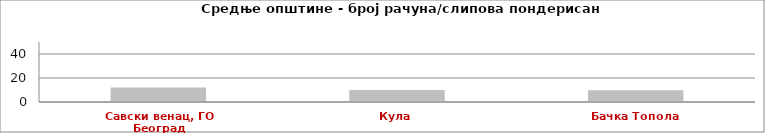
| Category | Series 0 |
|---|---|
| Савски венац, ГО Београд | 11.994 |
| Кула | 9.986 |
| Бачка Топола | 9.801 |